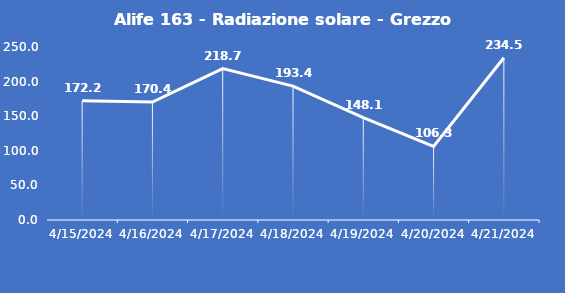
| Category | Alife 163 - Radiazione solare - Grezzo (W/m2) |
|---|---|
| 4/15/24 | 172.2 |
| 4/16/24 | 170.4 |
| 4/17/24 | 218.7 |
| 4/18/24 | 193.4 |
| 4/19/24 | 148.1 |
| 4/20/24 | 106.3 |
| 4/21/24 | 234.5 |